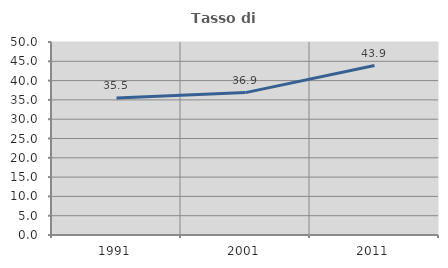
| Category | Tasso di occupazione   |
|---|---|
| 1991.0 | 35.461 |
| 2001.0 | 36.889 |
| 2011.0 | 43.891 |